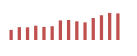
| Category | Importações (2) |
|---|---|
| 0 | 63256.661 |
| 1 | 80362.628 |
| 2 | 79098.748 |
| 3 | 89493.365 |
| 4 | 81914.569 |
| 5 | 86371.3 |
| 6 | 122399.001 |
| 7 | 125153.991 |
| 8 | 116754.909 |
| 9 | 110190.536 |
| 10 | 137205.926 |
| 11 | 154727.051 |
| 12 | 169208.338 |
| 13 | 166254.713 |